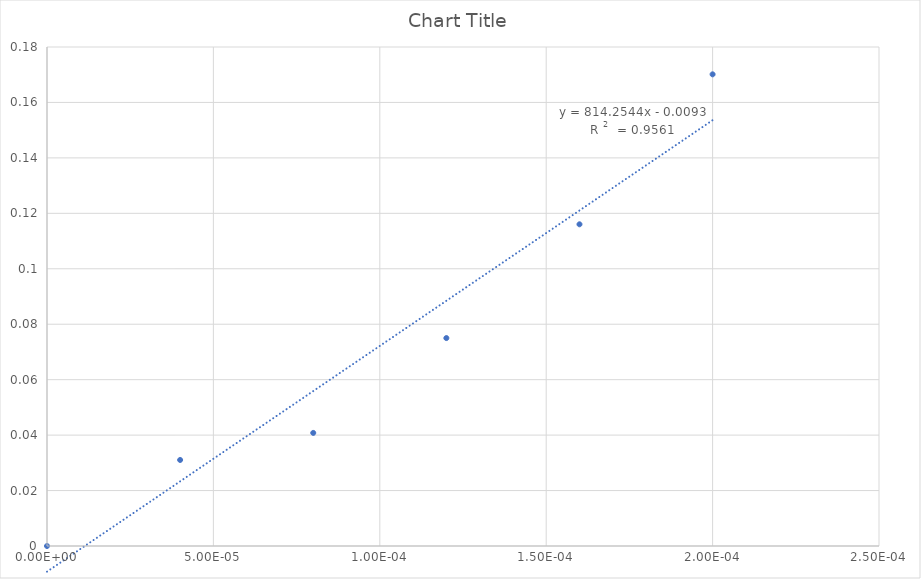
| Category | Series 0 |
|---|---|
| 0.0002 | 0.17 |
| 0.00016 | 0.116 |
| 0.00012 | 0.075 |
| 8e-05 | 0.041 |
| 4e-05 | 0.031 |
| 0.0 | 0 |